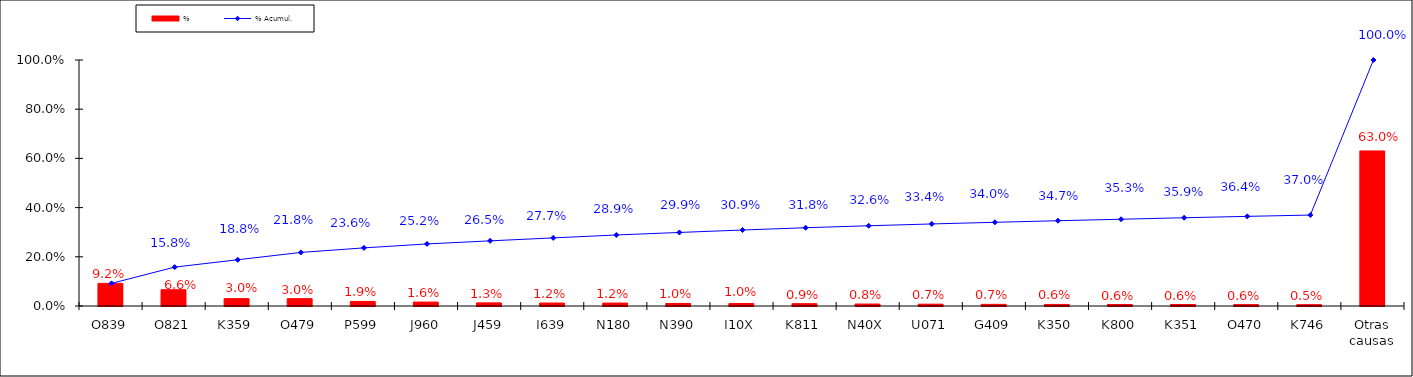
| Category | % |
|---|---|
| O839 | 0.092 |
| O821 | 0.066 |
| K359 | 0.03 |
| O479 | 0.03 |
| P599 | 0.019 |
| J960 | 0.016 |
| J459 | 0.013 |
| I639 | 0.012 |
| N180 | 0.012 |
| N390 | 0.01 |
| I10X | 0.01 |
| K811 | 0.009 |
| N40X | 0.008 |
| U071 | 0.007 |
| G409 | 0.007 |
| K350 | 0.006 |
| K800 | 0.006 |
| K351 | 0.006 |
| O470 | 0.006 |
| K746 | 0.005 |
| Otras causas | 0.63 |